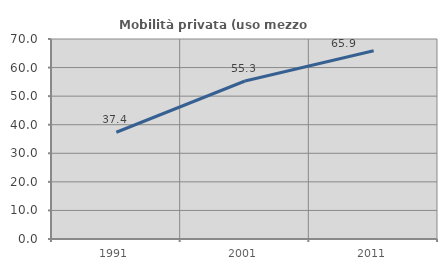
| Category | Mobilità privata (uso mezzo privato) |
|---|---|
| 1991.0 | 37.365 |
| 2001.0 | 55.305 |
| 2011.0 | 65.913 |